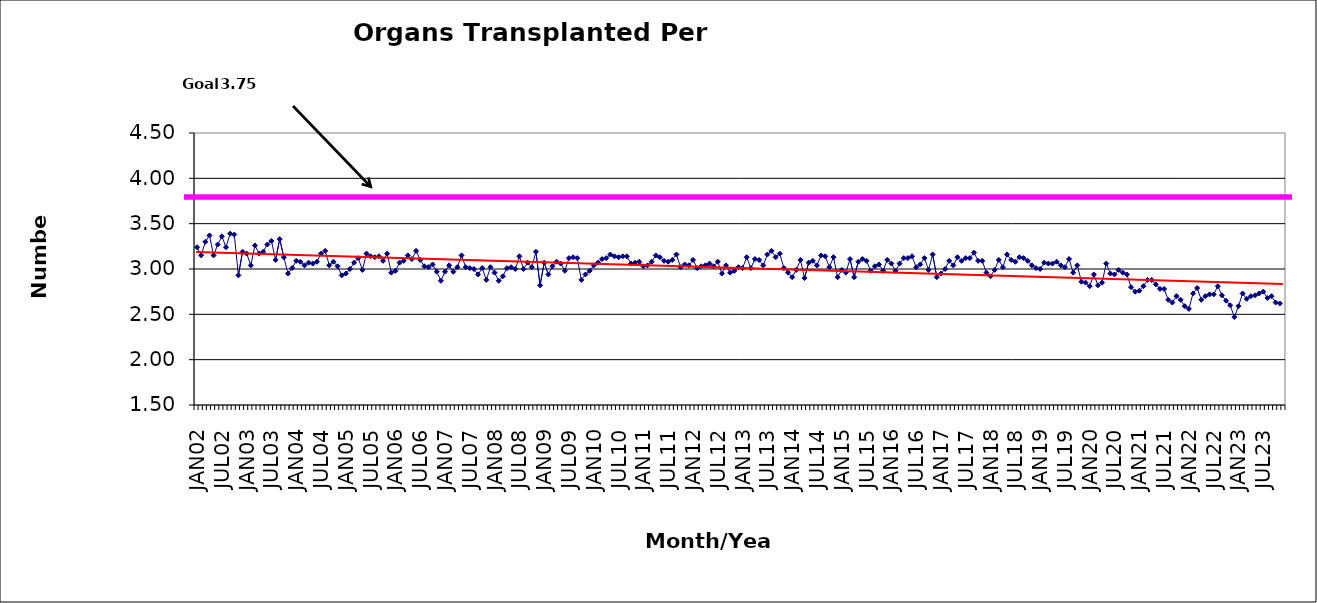
| Category | Series 0 |
|---|---|
| JAN02 | 3.24 |
| FEB02 | 3.15 |
| MAR02 | 3.3 |
| APR02 | 3.37 |
| MAY02 | 3.15 |
| JUN02 | 3.27 |
| JUL02 | 3.36 |
| AUG02 | 3.24 |
| SEP02 | 3.39 |
| OCT02 | 3.38 |
| NOV02 | 2.93 |
| DEC02 | 3.19 |
| JAN03 | 3.17 |
| FEB03 | 3.04 |
| MAR03 | 3.26 |
| APR03 | 3.17 |
| MAY03 | 3.19 |
| JUN03 | 3.27 |
| JUL03 | 3.31 |
| AUG03 | 3.1 |
| SEP03 | 3.33 |
| OCT03 | 3.13 |
| NOV03 | 2.95 |
| DEC03 | 3.01 |
| JAN04 | 3.09 |
| FEB04 | 3.08 |
| MAR04 | 3.04 |
| APR04 | 3.07 |
| MAY04 | 3.06 |
| JUN04 | 3.08 |
| JUL04 | 3.17 |
| AUG04 | 3.2 |
| SEP04 | 3.04 |
| OCT04 | 3.08 |
| NOV04 | 3.03 |
| DEC04 | 2.93 |
| JAN05 | 2.95 |
| FEB05 | 3 |
| MAR05 | 3.07 |
| APR05 | 3.12 |
| MAY05 | 2.99 |
| JUN05 | 3.17 |
| JUL05 | 3.14 |
| AUG05 | 3.13 |
| SEP05 | 3.14 |
| OCT05 | 3.09 |
| NOV05 | 3.17 |
| DEC05 | 2.96 |
| JAN06 | 2.98 |
| FEB06 | 3.07 |
| MAR06 | 3.09 |
| APR06 | 3.15 |
| MAY06 | 3.11 |
| JUN06 | 3.2 |
| JUL06 | 3.1 |
| AUG06 | 3.03 |
| SEP06 | 3.02 |
| OCT06 | 3.05 |
| NOV06 | 2.97 |
| DEC06 | 2.87 |
| JAN07 | 2.97 |
| FEB07 | 3.04 |
| MAR07 | 2.97 |
| APR07 | 3.02 |
| MAY07 | 3.15 |
| JUN07 | 3.02 |
| JUL07 | 3.01 |
| AUG07 | 3 |
| SEP07 | 2.94 |
| OCT07 | 3.01 |
| NOV07 | 2.88 |
| DEC07 | 3.02 |
| JAN08 | 2.96 |
| FEB08 | 2.87 |
| MAR08 | 2.92 |
| APR08 | 3.01 |
| MAY08 | 3.02 |
| JUN08 | 3 |
| JUL08 | 3.14 |
| AUG08 | 3 |
| SEP08 | 3.07 |
| OCT08 | 3.02 |
| NOV08 | 3.19 |
| DEC08 | 2.82 |
| JAN09 | 3.07 |
| FEB09 | 2.94 |
| MAR09 | 3.03 |
| APR09 | 3.08 |
| MAY09 | 3.06 |
| JUN09 | 2.98 |
| JUL09 | 3.12 |
| AUG09 | 3.13 |
| SEP09 | 3.12 |
| OCT09 | 2.88 |
| NOV09 | 2.94 |
| DEC09 | 2.98 |
| JAN10 | 3.04 |
| FEB10 | 3.07 |
| MAR10 | 3.11 |
| APR10 | 3.12 |
| MAY10 | 3.16 |
| JUN10 | 3.14 |
| JUL10 | 3.13 |
| AUG10 | 3.14 |
| SEP10 | 3.14 |
| OCT10 | 3.06 |
| NOV10 | 3.07 |
| DEC10 | 3.08 |
| JAN11 | 3.03 |
| FEB11 | 3.04 |
| MAR11 | 3.08 |
| APR11 | 3.15 |
| MAY11 | 3.13 |
| JUN11 | 3.09 |
| JUL11 | 3.08 |
| AUG11 | 3.1 |
| SEP11 | 3.16 |
| OCT11 | 3.02 |
| NOV11 | 3.05 |
| DEC11 | 3.04 |
| JAN12 | 3.1 |
| FEB12 | 3.01 |
| MAR12 | 3.03 |
| APR12 | 3.04 |
| MAY12 | 3.06 |
| JUN12 | 3.03 |
| JUL12 | 3.08 |
| AUG12 | 2.95 |
| SEP12 | 3.04 |
| OCT12 | 2.96 |
| NOV12 | 2.98 |
| DEC12 | 3.02 |
| JAN13 | 3.01 |
| FEB13 | 3.13 |
| MAR13 | 3.01 |
| APR13 | 3.11 |
| MAY13 | 3.1 |
| JUN13 | 3.04 |
| JUL13 | 3.16 |
| AUG13 | 3.2 |
| SEP13 | 3.13 |
| OCT13 | 3.17 |
| NOV13 | 3.01 |
| DEC13 | 2.96 |
| JAN14 | 2.91 |
| FEB14 | 2.99 |
| MAR14 | 3.1 |
| APR14 | 2.9 |
| MAY14 | 3.07 |
| JUN14 | 3.09 |
| JUL14 | 3.04 |
| AUG14 | 3.15 |
| SEP14 | 3.14 |
| OCT14 | 3.02 |
| NOV14 | 3.13 |
| DEC14 | 2.91 |
| JAN15 | 2.99 |
| FEB15 | 2.96 |
| MAR15 | 3.11 |
| APR15 | 2.91 |
| MAY15 | 3.08 |
| JUN15 | 3.11 |
| JUL15 | 3.09 |
| AUG15 | 2.98 |
| SEP15 | 3.03 |
| OCT15 | 3.05 |
| NOV15 | 2.98 |
| DEC15 | 3.1 |
| JAN16 | 3.06 |
| FEB16 | 2.98 |
| MAR16 | 3.06 |
| APR16 | 3.12 |
| MAY16 | 3.12 |
| JUN16 | 3.14 |
| JUL16 | 3.02 |
| AUG16 | 3.05 |
| SEP16 | 3.12 |
| OCT16 | 2.99 |
| NOV16 | 3.16 |
| DEC16 | 2.91 |
| JAN17 | 2.95 |
| FEB17 | 3 |
| MAR17 | 3.09 |
| APR17 | 3.04 |
| MAY17 | 3.13 |
| JUN17 | 3.09 |
| JUL17 | 3.12 |
| AUG17 | 3.12 |
| SEP17 | 3.18 |
| OCT17 | 3.09 |
| NOV17 | 3.09 |
| DEC17 | 2.96 |
| JAN18 | 2.92 |
| FEB18 | 2.99 |
| MAR18 | 3.1 |
| APR18 | 3.02 |
| MAY18 | 3.16 |
| JUN18 | 3.1 |
| JUL18 | 3.08 |
| AUG18 | 3.13 |
| SEP18 | 3.12 |
| OCT18 | 3.09 |
| NOV18 | 3.04 |
| DEC18 | 3.01 |
| JAN19 | 3 |
| FEB19 | 3.07 |
| MAR19 | 3.06 |
| APR19 | 3.06 |
| MAY19 | 3.08 |
| JUN19 | 3.04 |
| JUL19 | 3.02 |
| AUG19 | 3.11 |
| SEP19 | 2.96 |
| OCT19 | 3.04 |
| NOV19 | 2.86 |
| DEC19 | 2.85 |
| JAN20 | 2.81 |
| FEB20 | 2.94 |
| MAR20 | 2.82 |
| APR20 | 2.85 |
| MAY20 | 3.06 |
| JUN20 | 2.95 |
| JUL20 | 2.94 |
| AUG20 | 2.99 |
| SEP20 | 2.96 |
| OCT20 | 2.94 |
| NOV20 | 2.8 |
| DEC20 | 2.75 |
| JAN21 | 2.76 |
| FEB21 | 2.81 |
| MAR21 | 2.88 |
| APR21 | 2.88 |
| MAY21 | 2.83 |
| JUN21 | 2.78 |
| JUL21 | 2.78 |
| AUG21 | 2.66 |
| SEP21 | 2.63 |
| OCT21 | 2.7 |
| NOV21 | 2.66 |
| DEC21 | 2.59 |
| JAN22 | 2.56 |
| FEB22 | 2.73 |
| MAR22 | 2.79 |
| APR22 | 2.66 |
| MAY22 | 2.7 |
| JUN22 | 2.72 |
| JUL22 | 2.72 |
| AUG22 | 2.81 |
| SEP22 | 2.71 |
| OCT22 | 2.65 |
| NOV22 | 2.6 |
| DEC22 | 2.47 |
| JAN23 | 2.59 |
| FEB23 | 2.73 |
| MAR23 | 2.67 |
| APR23 | 2.7 |
| MAY23 | 2.71 |
| JUN23 | 2.73 |
| JUL23 | 2.75 |
| AUG23 | 2.68 |
| SEP23 | 2.7 |
| OCT23 | 2.63 |
| NOV23 | 2.62 |